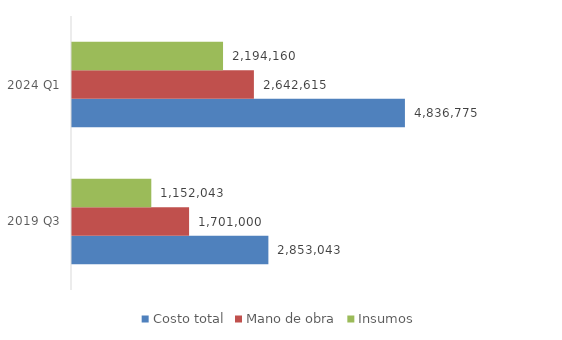
| Category | Costo total | Mano de obra | Insumos |
|---|---|---|---|
| 2019 Q3 | 2853043 | 1701000 | 1152043 |
| 2024 Q1 | 4836774.56 | 2642615 | 2194159.56 |